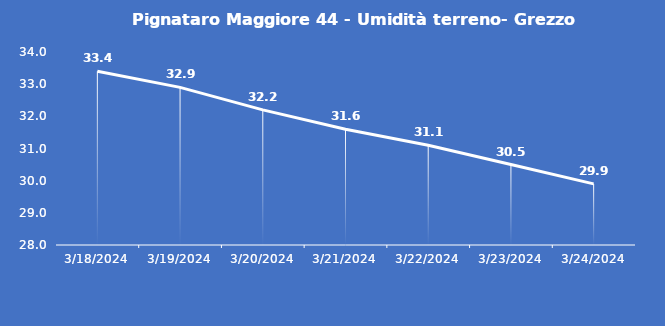
| Category | Pignataro Maggiore 44 - Umidità terreno- Grezzo (%VWC) |
|---|---|
| 3/18/24 | 33.4 |
| 3/19/24 | 32.9 |
| 3/20/24 | 32.2 |
| 3/21/24 | 31.6 |
| 3/22/24 | 31.1 |
| 3/23/24 | 30.5 |
| 3/24/24 | 29.9 |